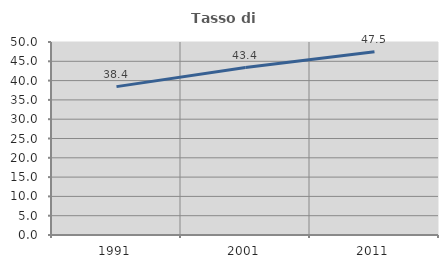
| Category | Tasso di occupazione   |
|---|---|
| 1991.0 | 38.436 |
| 2001.0 | 43.371 |
| 2011.0 | 47.486 |